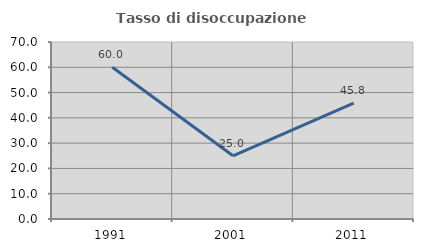
| Category | Tasso di disoccupazione giovanile  |
|---|---|
| 1991.0 | 60 |
| 2001.0 | 25 |
| 2011.0 | 45.833 |